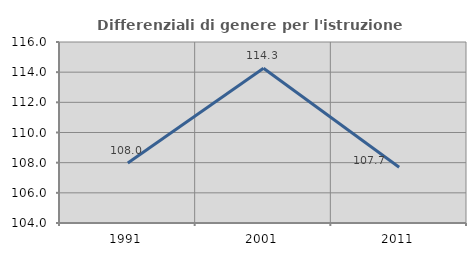
| Category | Differenziali di genere per l'istruzione superiore |
|---|---|
| 1991.0 | 107.984 |
| 2001.0 | 114.265 |
| 2011.0 | 107.697 |